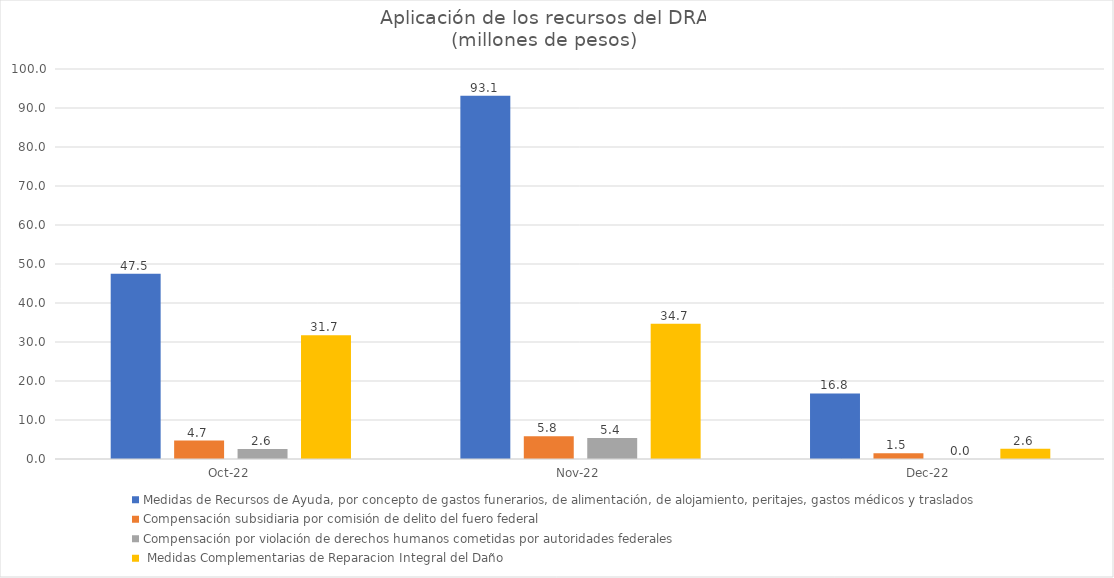
| Category | Medidas de Recursos de Ayuda, por concepto de gastos funerarios, de alimentación, de alojamiento, peritajes, gastos médicos y traslados | Compensación subsidiaria por comisión de delito del fuero federal | Compensación por violación de derechos humanos cometidas por autoridades federales |  Medidas Complementarias de Reparacion Integral del Daño |
|---|---|---|---|---|
| 2022-10-01 | 47.478 | 4.743 | 2.552 | 31.733 |
| 2022-11-01 | 93.128 | 5.847 | 5.364 | 34.651 |
| 2022-12-01 | 16.824 | 1.5 | 0 | 2.63 |